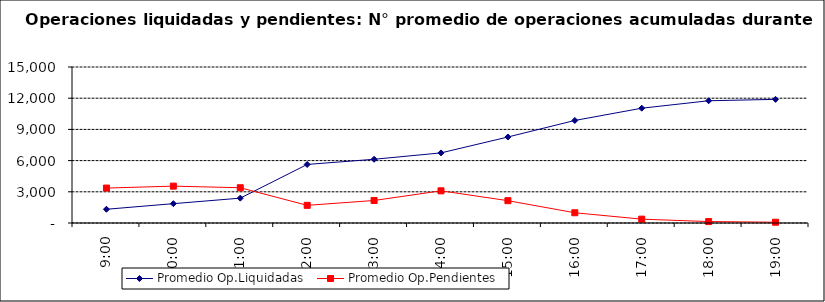
| Category | Promedio Op.Liquidadas | Promedio Op.Pendientes |
|---|---|---|
| 0.375 | 1322.05 | 3359.15 |
| 0.4166666666666667 | 1858.95 | 3545.15 |
| 0.4583333333333333 | 2389.8 | 3390.05 |
| 0.5 | 5630.9 | 1698.9 |
| 0.5416666666666666 | 6127.35 | 2166.45 |
| 0.5833333333333334 | 6740.95 | 3094 |
| 0.625 | 8269.45 | 2145.75 |
| 0.6666666666666666 | 9859.7 | 984.6 |
| 0.7083333333333334 | 11037.1 | 369.95 |
| 0.75 | 11753.45 | 137.15 |
| 0.7916666666666666 | 11890 | 75.1 |